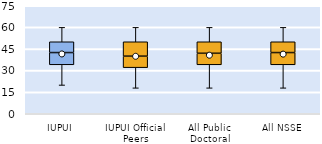
| Category | 25th | 50th | 75th |
|---|---|---|---|
| IUPUI | 34 | 8.5 | 7.5 |
| IUPUI Official Peers | 32 | 8 | 10 |
| All Public Doctoral | 34 | 8 | 8 |
| All NSSE | 34 | 8.5 | 7.5 |